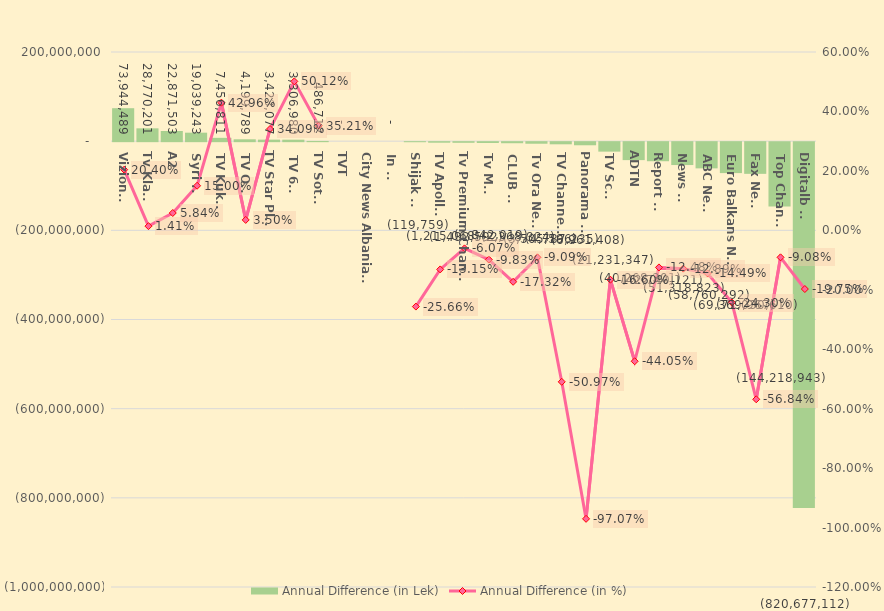
| Category | Annual Difference (in Lek) |
|---|---|
| Vizion + | 73944489 |
| Tv Klan  | 28770201 |
| A2 | 22871503 |
| Syri Tv | 19039243 |
| TV Kukësi | 7456811 |
| TV Ora | 4199789 |
| TV Star Plus | 3423077 |
| TV 6+1 | 3306980 |
| TV Sot 7 | 486712 |
| TVT | 0 |
| City News Albania HD | 0 |
| In Tv | 0 |
| Shijak Tv | -119759 |
| TV Apollon | -1215068 |
| Tv Premium Channel | -1432592 |
| Tv Mati | -1842019 |
| CLUB TV | -2368324 |
| Tv Ora News | -3505596 |
| TV Channel 1 | -4787235 |
| Panorama Tv | -6961408 |
| TV Scan | -21231347 |
| ADTN | -40268301 |
| Report Tv | -42740121 |
| News 24 | -51318823 |
| ABC News | -58760292 |
| Euro Balkans News | -69369967 |
| Fax News | -71030610 |
| Top Channel | -144218943 |
| Digitalb TV | -820677112 |